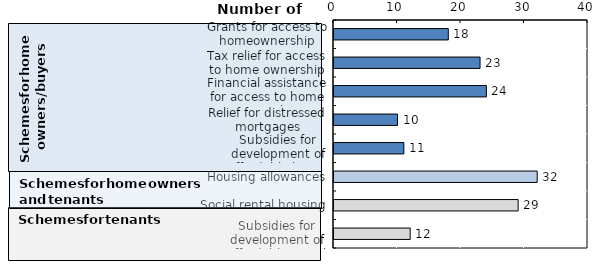
| Category | Number of countries |
|---|---|
| Grants for access to homeownership | 18 |
| Tax relief for access to home ownership | 23 |
| Financial assistance for access to home ownership | 24 |
| Relief for distressed mortgages | 10 |
| Subsidies for development of affordable home ownership | 11 |
| Housing allowances | 32 |
| Social rental housing | 29 |
| Subsidies for development of affordable rental housing | 12 |